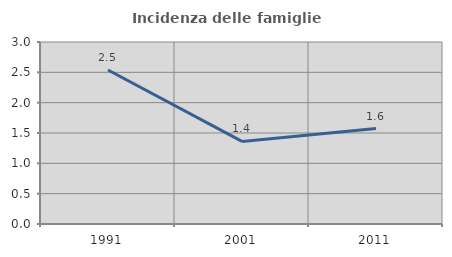
| Category | Incidenza delle famiglie numerose |
|---|---|
| 1991.0 | 2.538 |
| 2001.0 | 1.361 |
| 2011.0 | 1.573 |